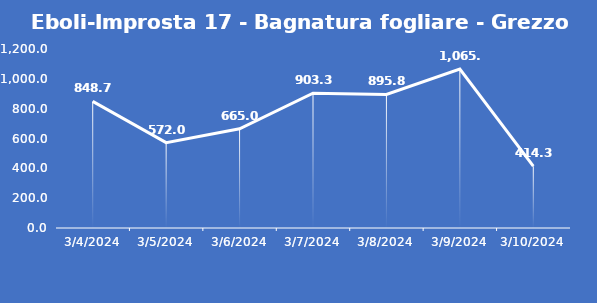
| Category | Eboli-Improsta 17 - Bagnatura fogliare - Grezzo (min) |
|---|---|
| 3/4/24 | 848.7 |
| 3/5/24 | 572 |
| 3/6/24 | 665 |
| 3/7/24 | 903.3 |
| 3/8/24 | 895.8 |
| 3/9/24 | 1065.6 |
| 3/10/24 | 414.3 |